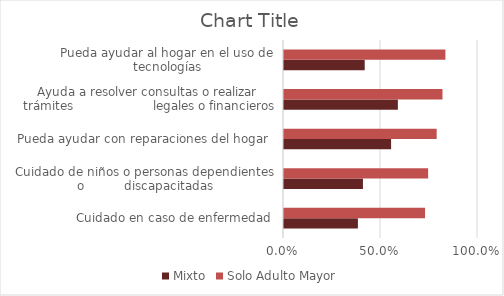
| Category | Mixto | Solo Adulto Mayor |
|---|---|---|
| Cuidado en caso de enfermedad | 0.381 | 0.727 |
| Cuidado de niños o personas dependientes o          discapacitadas | 0.407 | 0.743 |
| Pueda ayudar con reparaciones del hogar  | 0.552 | 0.787 |
| Ayuda a resolver consultas o realizar trámites                    legales o financieros | 0.587 | 0.817 |
| Pueda ayudar al hogar en el uso de tecnologías | 0.416 | 0.832 |